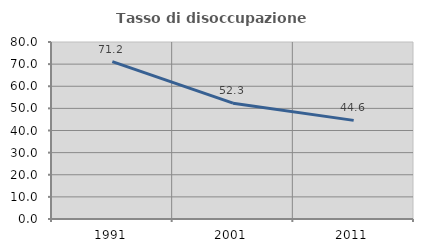
| Category | Tasso di disoccupazione giovanile  |
|---|---|
| 1991.0 | 71.161 |
| 2001.0 | 52.344 |
| 2011.0 | 44.578 |